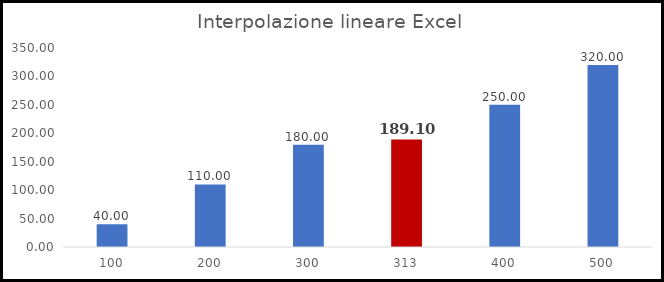
| Category | Series 0 |
|---|---|
| 100.0 | 40 |
| 200.0 | 110 |
| 300.0 | 180 |
| 313.0 | 189.1 |
| 400.0 | 250 |
| 500.0 | 320 |